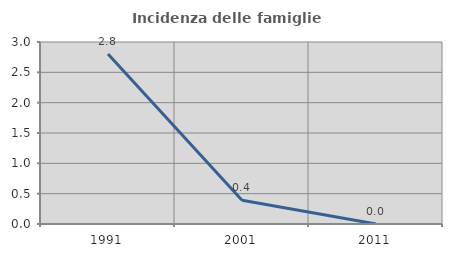
| Category | Incidenza delle famiglie numerose |
|---|---|
| 1991.0 | 2.804 |
| 2001.0 | 0.391 |
| 2011.0 | 0 |